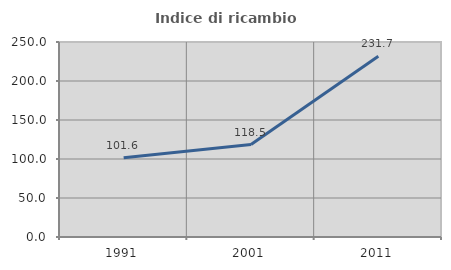
| Category | Indice di ricambio occupazionale  |
|---|---|
| 1991.0 | 101.554 |
| 2001.0 | 118.471 |
| 2011.0 | 231.677 |